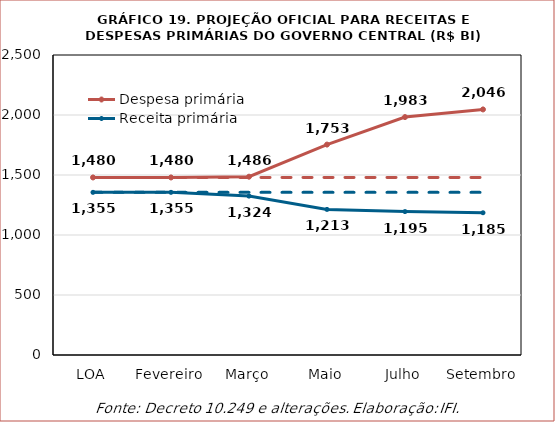
| Category | Despesa primária | Receita primária | Série3 | Série4 |
|---|---|---|---|---|
| LOA | 1479.504 | 1355.433 | 1355.433 | 1479.504 |
| Fevereiro | 1479.504 | 1355.433 | 1355.433 | 1479.504 |
| Março | 1485.834 | 1324.211 | 1355.433 | 1479.504 |
| Maio | 1753.498 | 1212.964 | 1355.433 | 1479.504 |
| Julho | 1982.798 | 1195.348 | 1355.433 | 1479.504 |
| Setembro | 2046.396 | 1185.394 | 1355.433 | 1479.504 |